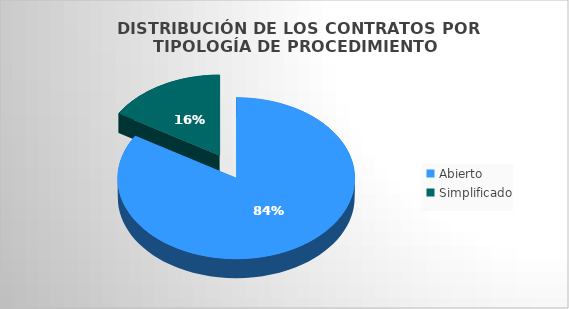
| Category | Importe adjudicado | Porcentaje |
|---|---|---|
| Abierto  | 1445234.677 | 0.837 |
| Simplificado | 280782.27 | 0.163 |